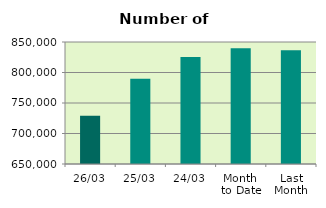
| Category | Series 0 |
|---|---|
| 26/03 | 728914 |
| 25/03 | 789780 |
| 24/03 | 825286 |
| Month 
to Date | 839633.3 |
| Last
Month | 836497.7 |